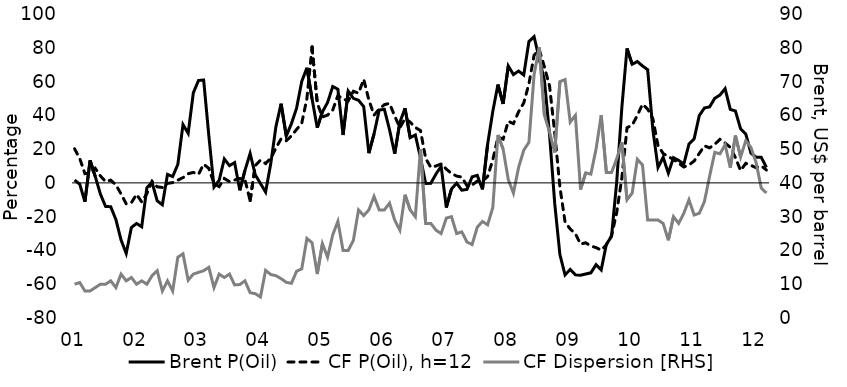
| Category | Brent P(Oil) | CF P(Oil), h=12 |
|---|---|---|
| 2001-01-01 | 1.665 | 20.192 |
| 2001-02-01 | -0.796 | 14.414 |
| 2001-03-01 | -11.176 | 5.485 |
| 2001-04-01 | 13.354 | 5.652 |
| 2001-05-01 | 3.832 | 8.621 |
| 2001-06-01 | -6.604 | 4.132 |
| 2001-07-01 | -13.925 | 0.816 |
| 2001-08-01 | -14.118 | 1.619 |
| 2001-09-01 | -21.704 | -1.181 |
| 2001-10-01 | -33.786 | -6.513 |
| 2001-11-01 | -41.759 | -12.406 |
| 2001-12-01 | -26.424 | -11.719 |
| 2002-01-01 | -24.025 | -6.8 |
| 2002-02-01 | -25.976 | -11.283 |
| 2002-03-01 | -2.91 | -6.327 |
| 2002-04-01 | 0.391 | 0.886 |
| 2002-05-01 | -10.615 | -2.324 |
| 2002-06-01 | -12.951 | -2.704 |
| 2002-07-01 | 5.012 | -0.3 |
| 2002-08-01 | 3.74 | 0.176 |
| 2002-09-01 | 10.963 | 1.651 |
| 2002-10-01 | 34.521 | 3.11 |
| 2002-11-01 | 29.356 | 5.432 |
| 2002-12-01 | 53.333 | 6.209 |
| 2003-01-01 | 60.626 | 5.054 |
| 2003-02-01 | 60.917 | 11.055 |
| 2003-03-01 | 28.071 | 8.596 |
| 2003-04-01 | -2.456 | -0.366 |
| 2003-05-01 | 1.494 | -2.19 |
| 2003-06-01 | 14.173 | 2.62 |
| 2003-07-01 | 10.206 | 0.754 |
| 2003-08-01 | 12.017 | 1.701 |
| 2003-09-01 | -4.375 | 2.624 |
| 2003-10-01 | 7.405 | 1.893 |
| 2003-11-01 | 17.429 | -10.444 |
| 2003-12-01 | 4.769 | 10.323 |
| 2004-01-01 | -0.352 | 13.465 |
| 2004-02-01 | -5.452 | 11.463 |
| 2004-03-01 | 11.404 | 14.557 |
| 2004-04-01 | 33.333 | 20.644 |
| 2004-05-01 | 46.92 | 26.111 |
| 2004-06-01 | 27.731 | 24.927 |
| 2004-07-01 | 35.106 | 27.863 |
| 2004-08-01 | 44.251 | 31.648 |
| 2004-09-01 | 60.074 | 35.343 |
| 2004-10-01 | 68.199 | 50.004 |
| 2004-11-01 | 49.635 | 80.499 |
| 2004-12-01 | 32.697 | 47.241 |
| 2005-01-01 | 42.014 | 39.025 |
| 2005-02-01 | 47.587 | 40.132 |
| 2005-03-01 | 57.041 | 43.127 |
| 2005-04-01 | 55.456 | 51.762 |
| 2005-05-01 | 28.349 | 49.674 |
| 2005-06-01 | 54.334 | 48.551 |
| 2005-07-01 | 50.065 | 54.252 |
| 2005-08-01 | 48.943 | 53.132 |
| 2005-09-01 | 45.182 | 61.352 |
| 2005-10-01 | 17.581 | 49.125 |
| 2005-11-01 | 28.99 | 40.11 |
| 2005-12-01 | 43.127 | 43.711 |
| 2006-01-01 | 43.564 | 46.32 |
| 2006-02-01 | 31.519 | 47.08 |
| 2006-03-01 | 17.276 | 39.634 |
| 2006-04-01 | 35.827 | 32.594 |
| 2006-05-01 | 44.216 | 38.129 |
| 2006-06-01 | 26.791 | 35.975 |
| 2006-07-01 | 28.343 | 32.797 |
| 2006-08-01 | 14.854 | 30.999 |
| 2006-09-01 | -0.333 | 14.478 |
| 2006-10-01 | -0.239 | 9.22 |
| 2006-11-01 | 5.312 | 10.009 |
| 2006-12-01 | 9.797 | 11.207 |
| 2007-01-01 | -14.582 | 8.168 |
| 2007-02-01 | -3.605 | 5.557 |
| 2007-03-01 | -0.177 | 4.031 |
| 2007-04-01 | -4.316 | 3.415 |
| 2007-05-01 | -3.861 | -1.686 |
| 2007-06-01 | 3.572 | -1.249 |
| 2007-07-01 | 4.465 | 1.057 |
| 2007-08-01 | -3.817 | 0.951 |
| 2007-09-01 | 22.877 | 3.849 |
| 2007-10-01 | 42.24 | 13.605 |
| 2007-11-01 | 58.225 | 27.13 |
| 2007-12-01 | 46.766 | 25.906 |
| 2008-01-01 | 69.282 | 36.432 |
| 2008-02-01 | 64.162 | 35.093 |
| 2008-03-01 | 66.205 | 42.096 |
| 2008-04-01 | 63.858 | 47.348 |
| 2008-05-01 | 83.669 | 58.656 |
| 2008-06-01 | 86.554 | 75.63 |
| 2008-07-01 | 73.446 | 78.998 |
| 2008-08-01 | 60.805 | 68.669 |
| 2008-09-01 | 28.433 | 57.246 |
| 2008-10-01 | -12.283 | 29.508 |
| 2008-11-01 | -42.462 | -2.412 |
| 2008-12-01 | -54.533 | -23.252 |
| 2009-01-01 | -51.197 | -27.301 |
| 2009-02-01 | -54.398 | -30.096 |
| 2009-03-01 | -54.648 | -36.27 |
| 2009-04-01 | -53.957 | -35.442 |
| 2009-05-01 | -53.252 | -37.44 |
| 2009-06-01 | -48.448 | -38.286 |
| 2009-07-01 | -51.516 | -39.88 |
| 2009-08-01 | -36.32 | -36.637 |
| 2009-09-01 | -31.668 | -31.247 |
| 2009-10-01 | 0.481 | -17.663 |
| 2009-11-01 | 44.703 | 3.073 |
| 2009-12-01 | 79.582 | 32.654 |
| 2010-01-01 | 70.241 | 34.219 |
| 2010-02-01 | 71.855 | 39.952 |
| 2010-03-01 | 69.236 | 46.589 |
| 2010-04-01 | 67.021 | 43.651 |
| 2010-05-01 | 31.602 | 38.035 |
| 2010-06-01 | 9.112 | 22.201 |
| 2010-07-01 | 15.126 | 17.389 |
| 2010-08-01 | 5.779 | 15.542 |
| 2010-09-01 | 14.921 | 13.934 |
| 2010-10-01 | 13.294 | 11.664 |
| 2010-11-01 | 11.202 | 9.393 |
| 2010-12-01 | 22.941 | 10.612 |
| 2011-01-01 | 26.084 | 12.943 |
| 2011-02-01 | 39.9 | 17.467 |
| 2011-03-01 | 44.367 | 21.925 |
| 2011-04-01 | 45.002 | 20.742 |
| 2011-05-01 | 50.111 | 22.866 |
| 2011-06-01 | 52.004 | 25.807 |
| 2011-07-01 | 55.82 | 23.603 |
| 2011-08-01 | 43.539 | 21.056 |
| 2011-09-01 | 42.538 | 14.96 |
| 2011-10-01 | 32.019 | 7.299 |
| 2011-11-01 | 28.983 | 11.584 |
| 2011-12-01 | 17.614 | 10.408 |
| 2012-01-01 | 15.266 | 8.958 |
| 2012-02-01 | 15.14 | 10.068 |
| 2012-03-01 | 9.166 | 7.614 |